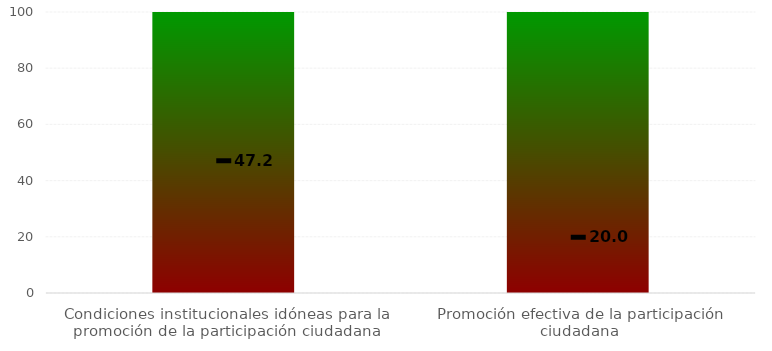
| Category | Rangos |
|---|---|
| Condiciones institucionales idóneas para la promoción de la participación ciudadana | 100 |
| Promoción efectiva de la participación ciudadana | 100 |